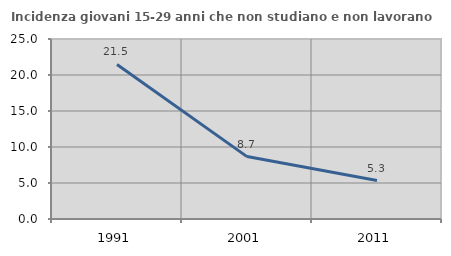
| Category | Incidenza giovani 15-29 anni che non studiano e non lavorano  |
|---|---|
| 1991.0 | 21.463 |
| 2001.0 | 8.667 |
| 2011.0 | 5.344 |